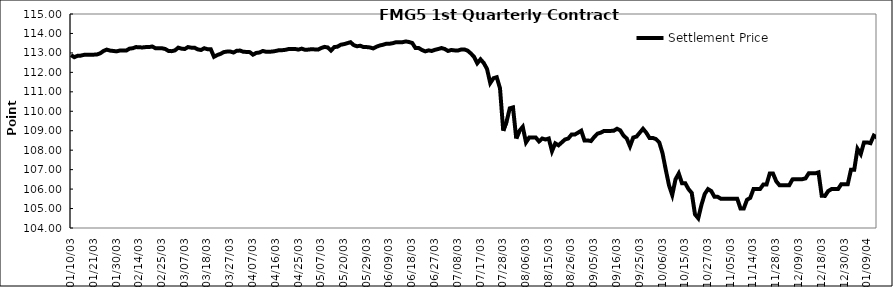
| Category | Settlement Price |
|---|---|
| 2003-01-10 | 112.89 |
| 2003-01-13 | 112.78 |
| 2003-01-14 | 112.85 |
| 2003-01-15 | 112.86 |
| 2003-01-16 | 112.9 |
| 2003-01-17 | 112.91 |
| 2003-01-20 | 112.91 |
| 2003-01-21 | 112.91 |
| 2003-01-22 | 112.92 |
| 2003-01-23 | 112.98 |
| 2003-01-24 | 113.1 |
| 2003-01-27 | 113.17 |
| 2003-01-28 | 113.12 |
| 2003-01-29 | 113.1 |
| 2003-01-30 | 113.08 |
| 2003-02-05 | 113.12 |
| 2003-02-06 | 113.12 |
| 2003-02-07 | 113.12 |
| 2003-02-10 | 113.22 |
| 2003-02-11 | 113.24 |
| 2003-02-13 | 113.3 |
| 2003-02-14 | 113.29 |
| 2003-02-17 | 113.28 |
| 2003-02-18 | 113.3 |
| 2003-02-19 | 113.3 |
| 2003-02-20 | 113.33 |
| 2003-02-21 | 113.24 |
| 2003-02-24 | 113.24 |
| 2003-02-25 | 113.24 |
| 2003-02-26 | 113.2 |
| 2003-02-27 | 113.1 |
| 2003-02-28 | 113.09 |
| 2003-03-03 | 113.13 |
| 2003-03-05 | 113.27 |
| 2003-03-06 | 113.22 |
| 2003-03-07 | 113.2 |
| 2003-03-10 | 113.3 |
| 2003-03-11 | 113.27 |
| 2003-03-12 | 113.27 |
| 2003-03-13 | 113.18 |
| 2003-03-14 | 113.15 |
| 2003-03-17 | 113.24 |
| 2003-03-18 | 113.19 |
| 2003-03-19 | 113.19 |
| 2003-03-20 | 112.8 |
| 2003-03-21 | 112.89 |
| 2003-03-24 | 112.95 |
| 2003-03-25 | 113.04 |
| 2003-03-26 | 113.07 |
| 2003-03-27 | 113.07 |
| 2003-03-28 | 113.02 |
| 2003-03-31 | 113.11 |
| 2003-04-01 | 113.12 |
| 2003-04-02 | 113.06 |
| 2003-04-03 | 113.05 |
| 2003-04-04 | 113.04 |
| 2003-04-07 | 112.91 |
| 2003-04-08 | 113 |
| 2003-04-09 | 113.02 |
| 2003-04-10 | 113.1 |
| 2003-04-11 | 113.06 |
| 2003-04-14 | 113.06 |
| 2003-04-15 | 113.07 |
| 2003-04-16 | 113.1 |
| 2003-04-17 | 113.14 |
| 2003-04-18 | 113.14 |
| 2003-04-21 | 113.16 |
| 2003-04-22 | 113.2 |
| 2003-04-23 | 113.2 |
| 2003-04-24 | 113.2 |
| 2003-04-25 | 113.17 |
| 2003-04-28 | 113.22 |
| 2003-04-29 | 113.16 |
| 2003-04-30 | 113.17 |
| 2003-05-02 | 113.19 |
| 2003-05-05 | 113.18 |
| 2003-05-06 | 113.17 |
| 2003-05-07 | 113.25 |
| 2003-05-08 | 113.31 |
| 2003-05-09 | 113.28 |
| 2003-05-12 | 113.12 |
| 2003-05-13 | 113.3 |
| 2003-05-16 | 113.32 |
| 2003-05-19 | 113.42 |
| 2003-05-20 | 113.45 |
| 2003-05-21 | 113.5 |
| 2003-05-22 | 113.55 |
| 2003-05-23 | 113.4 |
| 2003-05-26 | 113.34 |
| 2003-05-27 | 113.37 |
| 2003-05-28 | 113.3 |
| 2003-05-29 | 113.3 |
| 2003-05-30 | 113.28 |
| 2003-06-02 | 113.23 |
| 2003-06-03 | 113.32 |
| 2003-06-04 | 113.38 |
| 2003-06-05 | 113.42 |
| 2003-06-06 | 113.47 |
| 2003-06-09 | 113.47 |
| 2003-06-10 | 113.5 |
| 2003-06-11 | 113.55 |
| 2003-06-12 | 113.55 |
| 2003-06-13 | 113.55 |
| 2003-06-16 | 113.59 |
| 2003-06-17 | 113.56 |
| 2003-06-18 | 113.51 |
| 2003-06-19 | 113.25 |
| 2003-06-20 | 113.25 |
| 2003-06-23 | 113.15 |
| 2003-06-24 | 113.08 |
| 2003-06-25 | 113.13 |
| 2003-06-26 | 113.1 |
| 2003-06-27 | 113.16 |
| 2003-06-30 | 113.2 |
| 2003-07-01 | 113.25 |
| 2003-07-02 | 113.2 |
| 2003-07-03 | 113.1 |
| 2003-07-04 | 113.15 |
| 2003-07-07 | 113.13 |
| 2003-07-08 | 113.12 |
| 2003-07-09 | 113.17 |
| 2003-07-10 | 113.18 |
| 2003-07-11 | 113.12 |
| 2003-07-14 | 112.98 |
| 2003-07-15 | 112.8 |
| 2003-07-16 | 112.47 |
| 2003-07-17 | 112.67 |
| 2003-07-18 | 112.48 |
| 2003-07-21 | 112.18 |
| 2003-07-22 | 111.45 |
| 2003-07-23 | 111.7 |
| 2003-07-24 | 111.75 |
| 2003-07-25 | 111.18 |
| 2003-07-28 | 109 |
| 2003-07-29 | 109.45 |
| 2003-07-30 | 110.15 |
| 2003-07-31 | 110.2 |
| 2003-08-01 | 108.6 |
| 2003-08-04 | 109 |
| 2003-08-05 | 109.2 |
| 2003-08-06 | 108.4 |
| 2003-08-07 | 108.65 |
| 2003-08-08 | 108.65 |
| 2003-08-11 | 108.65 |
| 2003-08-12 | 108.45 |
| 2003-08-13 | 108.6 |
| 2003-08-14 | 108.55 |
| 2003-08-15 | 108.6 |
| 2003-08-18 | 107.95 |
| 2003-08-19 | 108.35 |
| 2003-08-20 | 108.25 |
| 2003-08-21 | 108.4 |
| 2003-08-22 | 108.55 |
| 2003-08-25 | 108.6 |
| 2003-08-26 | 108.8 |
| 2003-08-27 | 108.8 |
| 2003-08-28 | 108.9 |
| 2003-08-29 | 109 |
| 2003-09-02 | 108.5 |
| 2003-09-03 | 108.5 |
| 2003-09-04 | 108.47 |
| 2003-09-05 | 108.68 |
| 2003-09-08 | 108.85 |
| 2003-09-09 | 108.9 |
| 2003-09-10 | 108.99 |
| 2003-09-11 | 108.99 |
| 2003-09-12 | 108.99 |
| 2003-09-15 | 109 |
| 2003-09-16 | 109.1 |
| 2003-09-17 | 109.02 |
| 2003-09-18 | 108.75 |
| 2003-09-19 | 108.6 |
| 2003-09-22 | 108.2 |
| 2003-09-23 | 108.65 |
| 2003-09-24 | 108.7 |
| 2003-09-25 | 108.9 |
| 2003-09-26 | 109.1 |
| 2003-09-29 | 108.9 |
| 2003-09-30 | 108.63 |
| 2003-10-01 | 108.63 |
| 2003-10-02 | 108.57 |
| 2003-10-03 | 108.4 |
| 2003-10-06 | 107.85 |
| 2003-10-07 | 107 |
| 2003-10-08 | 106.2 |
| 2003-10-09 | 105.7 |
| 2003-10-10 | 106.5 |
| 2003-10-13 | 106.8 |
| 2003-10-14 | 106.3 |
| 2003-10-15 | 106.3 |
| 2003-10-16 | 106 |
| 2003-10-17 | 105.8 |
| 2003-10-20 | 104.7 |
| 2003-10-21 | 104.5 |
| 2003-10-22 | 105.2 |
| 2003-10-23 | 105.75 |
| 2003-10-27 | 106 |
| 2003-10-28 | 105.9 |
| 2003-10-29 | 105.6 |
| 2003-10-30 | 105.6 |
| 2003-10-31 | 105.5 |
| 2003-11-03 | 105.5 |
| 2003-11-04 | 105.5 |
| 2003-11-05 | 105.5 |
| 2003-11-06 | 105.5 |
| 2003-11-07 | 105.5 |
| 2003-11-10 | 105 |
| 2003-11-11 | 105 |
| 2003-11-12 | 105.45 |
| 2003-11-13 | 105.55 |
| 2003-11-14 | 106 |
| 2003-11-17 | 106 |
| 2003-11-18 | 106 |
| 2003-11-19 | 106.23 |
| 2003-11-20 | 106.23 |
| 2003-11-21 | 106.8 |
| 2003-11-27 | 106.8 |
| 2003-11-28 | 106.4 |
| 2003-12-01 | 106.2 |
| 2003-12-02 | 106.2 |
| 2003-12-03 | 106.2 |
| 2003-12-04 | 106.2 |
| 2003-12-05 | 106.5 |
| 2003-12-08 | 106.51 |
| 2003-12-09 | 106.51 |
| 2003-12-10 | 106.51 |
| 2003-12-11 | 106.55 |
| 2003-12-12 | 106.81 |
| 2003-12-15 | 106.81 |
| 2003-12-16 | 106.81 |
| 2003-12-17 | 106.86 |
| 2003-12-18 | 105.654 |
| 2003-12-19 | 105.65 |
| 2003-12-22 | 105.9 |
| 2003-12-23 | 106 |
| 2003-12-24 | 106 |
| 2003-12-26 | 106 |
| 2003-12-29 | 106.25 |
| 2003-12-30 | 106.25 |
| 2003-12-31 | 106.25 |
| 2004-01-02 | 107 |
| 2004-01-05 | 107 |
| 2004-01-06 | 108.07 |
| 2004-01-07 | 107.8 |
| 2004-01-08 | 108.4 |
| 2004-01-09 | 108.4 |
| 2004-01-12 | 108.36 |
| 2004-01-13 | 108.75 |
| 2004-01-14 | 108.65 |